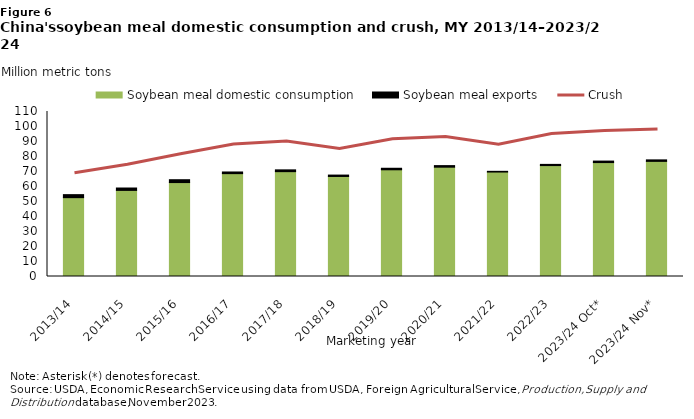
| Category | Soybean meal domestic consumption | Soybean meal exports |
|---|---|---|
| 0 | 52.56 | 2.017 |
| 1 | 57.4 | 1.595 |
| 2 | 62.62 | 1.909 |
| 3 | 68.575 | 1.111 |
| 4 | 69.9 | 1.198 |
| 5 | 66.685 | 0.932 |
| 6 | 71.145 | 1.012 |
| 7 | 72.875 | 1.052 |
| 8 | 69.63 | 0.484 |
| 9 | 73.95 | 0.795 |
| 10 | 75.95 | 1 |
| 11 | 76.75 | 1 |